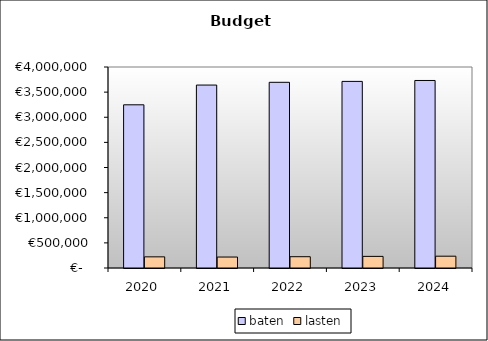
| Category | baten | lasten |
|---|---|---|
| 2020.0 | 3247614.156 | 221756.529 |
| 2021.0 | 3640714.821 | 218099.2 |
| 2022.0 | 3695441.459 | 224529.6 |
| 2023.0 | 3713587.449 | 231070.4 |
| 2024.0 | 3731733.439 | 234912 |